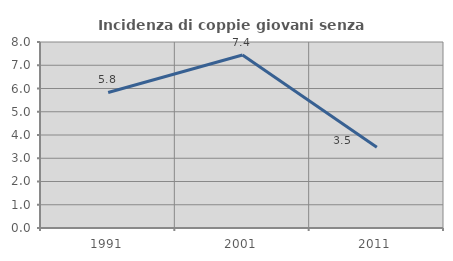
| Category | Incidenza di coppie giovani senza figli |
|---|---|
| 1991.0 | 5.83 |
| 2001.0 | 7.438 |
| 2011.0 | 3.473 |